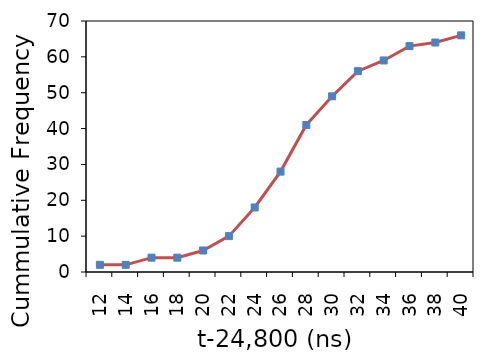
| Category | Series 1 |
|---|---|
| 12.0 | 2 |
| 14.0 | 2 |
| 16.0 | 4 |
| 18.0 | 4 |
| 20.0 | 6 |
| 22.0 | 10 |
| 24.0 | 18 |
| 26.0 | 28 |
| 28.0 | 41 |
| 30.0 | 49 |
| 32.0 | 56 |
| 34.0 | 59 |
| 36.0 | 63 |
| 38.0 | 64 |
| 40.0 | 66 |